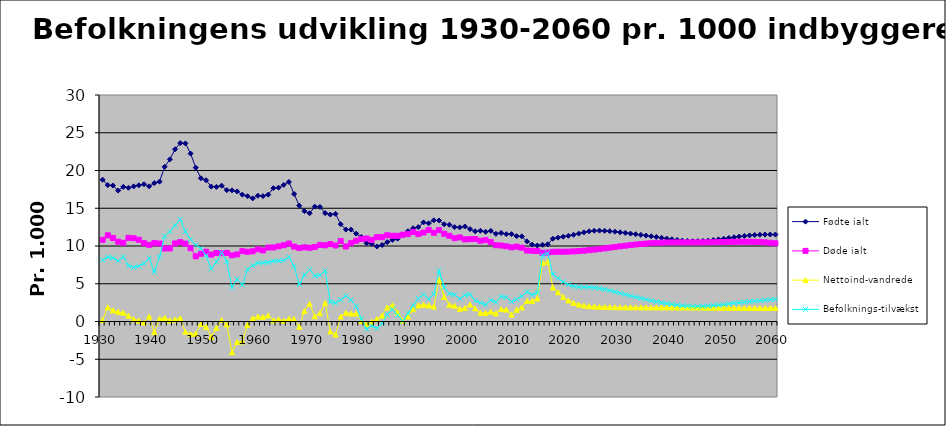
| Category | Fødte ialt | Døde ialt | Nettoind-vandrede | Befolknings-tilvækst |
|---|---|---|---|---|
| 1930.0 | 18.777 | 10.811 | 0.173 | 8.139 |
| 1931.0 | 18.067 | 11.408 | 1.877 | 8.536 |
| 1932.0 | 18.008 | 11.059 | 1.484 | 8.433 |
| 1933.0 | 17.343 | 10.577 | 1.283 | 8.049 |
| 1934.0 | 17.835 | 10.422 | 1.174 | 8.588 |
| 1935.0 | 17.709 | 11.082 | 0.774 | 7.401 |
| 1936.0 | 17.898 | 11.026 | 0.299 | 7.171 |
| 1937.0 | 18.042 | 10.819 | 0.126 | 7.349 |
| 1938.0 | 18.184 | 10.374 | -0.133 | 7.676 |
| 1939.0 | 17.9 | 10.157 | 0.664 | 8.408 |
| 1940.0 | 18.327 | 10.384 | -1.414 | 6.529 |
| 1941.0 | 18.526 | 10.329 | 0.372 | 8.569 |
| 1942.0 | 20.491 | 9.667 | 0.482 | 11.306 |
| 1943.0 | 21.477 | 9.674 | 0.123 | 11.925 |
| 1944.0 | 22.814 | 10.342 | 0.242 | 12.715 |
| 1945.0 | 23.63 | 10.514 | 0.42 | 13.535 |
| 1946.0 | 23.586 | 10.31 | -1.362 | 11.914 |
| 1947.0 | 22.244 | 9.712 | -1.66 | 10.872 |
| 1948.0 | 20.379 | 8.633 | -1.61 | 10.136 |
| 1949.0 | 18.979 | 8.975 | -0.33 | 9.674 |
| 1950.0 | 18.711 | 9.243 | -0.726 | 8.742 |
| 1951.0 | 17.867 | 8.859 | -2.034 | 6.974 |
| 1952.0 | 17.832 | 9.078 | -0.857 | 7.897 |
| 1953.0 | 17.995 | 9.048 | 0.194 | 9.141 |
| 1954.0 | 17.399 | 9.087 | -0.373 | 7.938 |
| 1955.0 | 17.37 | 8.768 | -4.077 | 4.525 |
| 1956.0 | 17.226 | 8.888 | -2.723 | 5.615 |
| 1957.0 | 16.804 | 9.317 | -2.642 | 4.845 |
| 1958.0 | 16.592 | 9.234 | -0.439 | 6.92 |
| 1959.0 | 16.312 | 9.303 | 0.403 | 7.413 |
| 1960.0 | 16.662 | 9.567 | 0.655 | 7.75 |
| 1961.0 | 16.614 | 9.413 | 0.597 | 7.797 |
| 1962.0 | 16.805 | 9.791 | 0.806 | 7.82 |
| 1963.0 | 17.662 | 9.81 | 0.143 | 7.995 |
| 1964.0 | 17.724 | 9.953 | 0.282 | 8.053 |
| 1965.0 | 18.097 | 10.1 | 0.101 | 8.098 |
| 1966.0 | 18.483 | 10.325 | 0.365 | 8.523 |
| 1967.0 | 16.89 | 9.924 | 0.341 | 7.306 |
| 1968.0 | 15.354 | 9.74 | -0.703 | 4.911 |
| 1969.0 | 14.613 | 9.826 | 1.385 | 6.172 |
| 1970.0 | 14.339 | 9.769 | 2.347 | 6.918 |
| 1971.0 | 15.222 | 9.869 | 0.687 | 6.04 |
| 1972.0 | 15.175 | 10.138 | 1.093 | 6.129 |
| 1973.0 | 14.357 | 10.09 | 2.445 | 6.713 |
| 1974.0 | 14.163 | 10.253 | -1.312 | 2.598 |
| 1975.0 | 14.259 | 10.069 | -1.724 | 2.466 |
| 1976.0 | 12.885 | 10.661 | 0.655 | 2.88 |
| 1977.0 | 12.181 | 9.938 | 1.148 | 3.391 |
| 1978.0 | 12.171 | 10.372 | 1.045 | 2.844 |
| 1979.0 | 11.633 | 10.692 | 1.067 | 2.008 |
| 1980.0 | 11.186 | 10.921 | 0.078 | 0.342 |
| 1981.0 | 10.361 | 10.999 | -0.36 | -0.998 |
| 1982.0 | 10.286 | 10.816 | -0.021 | -0.55 |
| 1983.0 | 9.933 | 11.171 | 0.336 | -0.902 |
| 1984.0 | 10.133 | 11.171 | 0.779 | -0.26 |
| 1985.0 | 10.516 | 11.422 | 1.859 | 0.953 |
| 1986.0 | 10.811 | 11.356 | 2.151 | 1.606 |
| 1987.0 | 10.97 | 11.344 | 1.205 | 0.831 |
| 1988.0 | 11.472 | 11.5 | 0.099 | 0.072 |
| 1989.0 | 11.96 | 11.579 | 0.671 | 1.052 |
| 1990.0 | 12.352 | 11.864 | 1.622 | 2.111 |
| 1991.0 | 12.505 | 11.577 | 2.125 | 3.054 |
| 1992.0 | 13.12 | 11.782 | 2.22 | 3.558 |
| 1993.0 | 13.004 | 12.124 | 2.134 | 3.014 |
| 1994.0 | 13.406 | 11.757 | 1.973 | 3.621 |
| 1995.0 | 13.377 | 12.103 | 5.475 | 6.749 |
| 1996.0 | 12.881 | 11.625 | 3.263 | 4.519 |
| 1997.0 | 12.822 | 11.355 | 2.22 | 3.687 |
| 1998.0 | 12.497 | 11.04 | 2.084 | 3.541 |
| 1999.0 | 12.465 | 11.133 | 1.674 | 3.006 |
| 2000.0 | 12.586 | 10.879 | 1.782 | 3.488 |
| 2001.0 | 12.235 | 10.906 | 2.244 | 3.574 |
| 2002.0 | 11.949 | 10.918 | 1.732 | 2.764 |
| 2003.0 | 12.015 | 10.695 | 1.168 | 2.488 |
| 2004.0 | 11.878 | 10.776 | 1.114 | 2.216 |
| 2005.0 | 12.009 | 10.518 | 1.313 | 2.804 |
| 2006.0 | 11.614 | 10.11 | 1.064 | 2.569 |
| 2007.0 | 11.729 | 10.06 | 1.638 | 3.308 |
| 2008.0 | 11.566 | 9.959 | 1.575 | 3.182 |
| 2009.0 | 11.571 | 9.823 | 0.9 | 2.648 |
| 2010.0 | 11.302 | 9.917 | 1.545 | 2.93 |
| 2011.0 | 11.275 | 9.768 | 1.862 | 3.369 |
| 2012.0 | 10.613 | 9.406 | 2.719 | 3.926 |
| 2013.0 | 10.181 | 9.362 | 2.704 | 3.524 |
| 2014.0 | 10.065 | 9.336 | 3.061 | 3.79 |
| 2015.0 | 10.162 | 9.106 | 7.751 | 8.808 |
| 2016.0 | 10.225 | 9.115 | 7.927 | 9.038 |
| 2017.0 | 10.962 | 9.233 | 4.5 | 6.229 |
| 2018.0 | 11.101 | 9.244 | 3.868 | 5.725 |
| 2019.0 | 11.23 | 9.243 | 3.263 | 5.25 |
| 2020.0 | 11.357 | 9.257 | 2.791 | 4.891 |
| 2021.0 | 11.492 | 9.285 | 2.464 | 4.671 |
| 2022.0 | 11.645 | 9.327 | 2.245 | 4.564 |
| 2023.0 | 11.81 | 9.381 | 2.111 | 4.54 |
| 2024.0 | 11.947 | 9.446 | 2.03 | 4.531 |
| 2025.0 | 12.023 | 9.521 | 1.979 | 4.481 |
| 2026.0 | 12.038 | 9.601 | 1.949 | 4.386 |
| 2027.0 | 12.012 | 9.688 | 1.925 | 4.25 |
| 2028.0 | 11.96 | 9.778 | 1.907 | 4.09 |
| 2029.0 | 11.892 | 9.867 | 1.895 | 3.92 |
| 2030.0 | 11.815 | 9.955 | 1.885 | 3.744 |
| 2031.0 | 11.732 | 10.04 | 1.88 | 3.572 |
| 2032.0 | 11.648 | 10.121 | 1.873 | 3.4 |
| 2033.0 | 11.562 | 10.197 | 1.871 | 3.236 |
| 2034.0 | 11.474 | 10.266 | 1.868 | 3.077 |
| 2035.0 | 11.383 | 10.325 | 1.863 | 2.921 |
| 2036.0 | 11.288 | 10.377 | 1.86 | 2.771 |
| 2037.0 | 11.189 | 10.417 | 1.858 | 2.63 |
| 2038.0 | 11.086 | 10.446 | 1.856 | 2.495 |
| 2039.0 | 10.983 | 10.464 | 1.855 | 2.374 |
| 2040.0 | 10.884 | 10.473 | 1.856 | 2.266 |
| 2041.0 | 10.795 | 10.475 | 1.854 | 2.175 |
| 2042.0 | 10.723 | 10.474 | 1.851 | 2.101 |
| 2043.0 | 10.673 | 10.473 | 1.848 | 2.047 |
| 2044.0 | 10.647 | 10.473 | 1.845 | 2.019 |
| 2045.0 | 10.647 | 10.475 | 1.842 | 2.015 |
| 2046.0 | 10.672 | 10.479 | 1.838 | 2.031 |
| 2047.0 | 10.72 | 10.486 | 1.833 | 2.066 |
| 2048.0 | 10.787 | 10.497 | 1.827 | 2.117 |
| 2049.0 | 10.87 | 10.509 | 1.82 | 2.181 |
| 2050.0 | 10.963 | 10.523 | 1.816 | 2.255 |
| 2051.0 | 11.061 | 10.537 | 1.813 | 2.337 |
| 2052.0 | 11.158 | 10.549 | 1.808 | 2.417 |
| 2053.0 | 11.25 | 10.56 | 1.802 | 2.492 |
| 2054.0 | 11.333 | 10.564 | 1.799 | 2.567 |
| 2055.0 | 11.402 | 10.559 | 1.796 | 2.64 |
| 2056.0 | 11.457 | 10.546 | 1.795 | 2.705 |
| 2057.0 | 11.495 | 10.52 | 1.794 | 2.769 |
| 2058.0 | 11.516 | 10.48 | 1.792 | 2.828 |
| 2059.0 | 11.521 | 10.427 | 1.791 | 2.885 |
| 2060.0 | 11.511 | 10.361 | 1.791 | 2.941 |